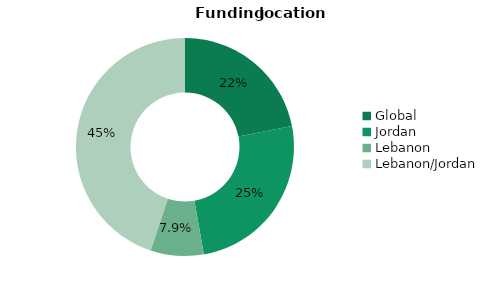
| Category | Series 0 |
|---|---|
| Global | 0.219 |
| Jordan | 0.253 |
| Lebanon | 0.079 |
| Lebanon/Jordan | 0.449 |